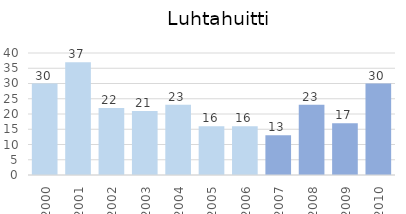
| Category | Series 0 |
|---|---|
| 2000.0 | 30 |
| 2001.0 | 37 |
| 2002.0 | 22 |
| 2003.0 | 21 |
| 2004.0 | 23 |
| 2005.0 | 16 |
| 2006.0 | 16 |
| 2007.0 | 13 |
| 2008.0 | 23 |
| 2009.0 | 17 |
| 2010.0 | 30 |